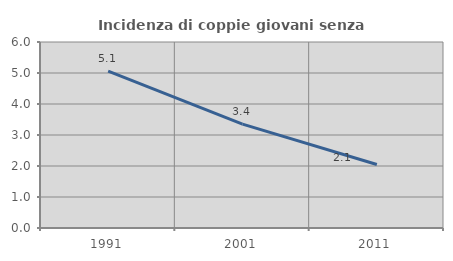
| Category | Incidenza di coppie giovani senza figli |
|---|---|
| 1991.0 | 5.064 |
| 2001.0 | 3.351 |
| 2011.0 | 2.05 |